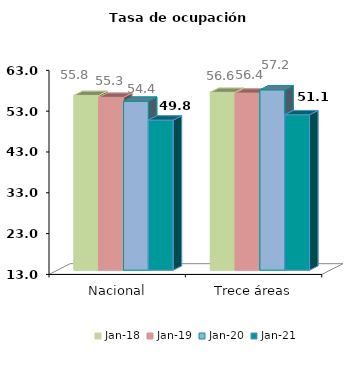
| Category | ene-18 | ene-19 | ene-20 | ene-21 |
|---|---|---|---|---|
| Nacional | 55.801 | 55.334 | 54.371 | 49.764 |
| Trece áreas | 56.568 | 56.362 | 57.156 | 51.062 |